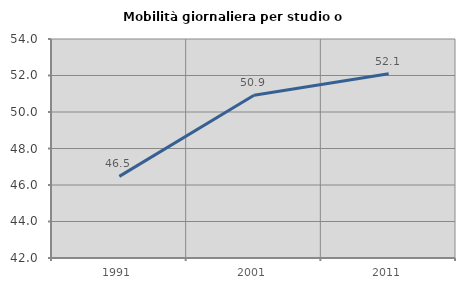
| Category | Mobilità giornaliera per studio o lavoro |
|---|---|
| 1991.0 | 46.474 |
| 2001.0 | 50.92 |
| 2011.0 | 52.097 |